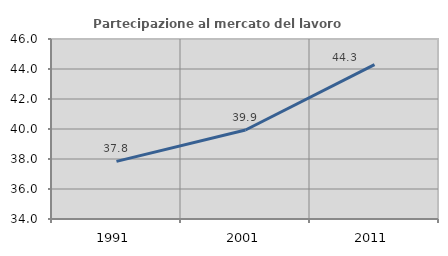
| Category | Partecipazione al mercato del lavoro  femminile |
|---|---|
| 1991.0 | 37.842 |
| 2001.0 | 39.933 |
| 2011.0 | 44.288 |